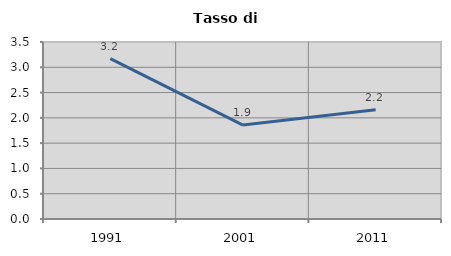
| Category | Tasso di disoccupazione   |
|---|---|
| 1991.0 | 3.171 |
| 2001.0 | 1.857 |
| 2011.0 | 2.162 |